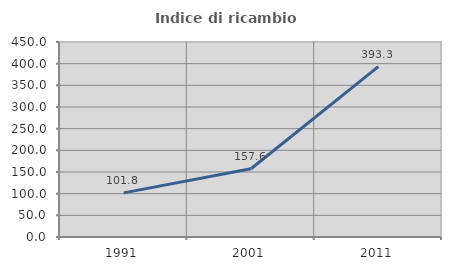
| Category | Indice di ricambio occupazionale  |
|---|---|
| 1991.0 | 101.818 |
| 2001.0 | 157.576 |
| 2011.0 | 393.333 |